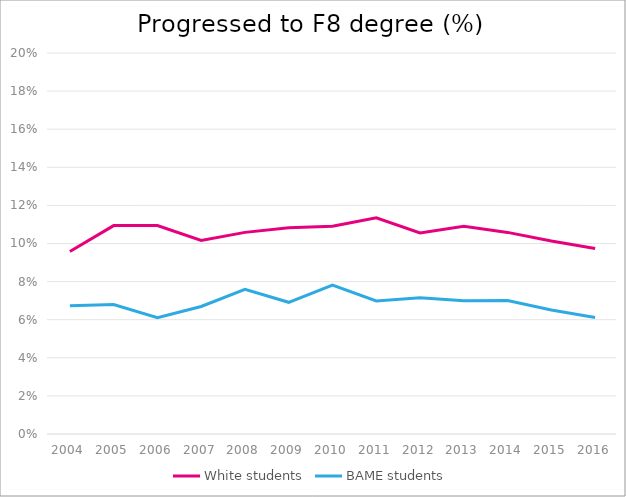
| Category | White students | BAME students |
|---|---|---|
| 2004.0 | 0.096 | 0.067 |
| 2005.0 | 0.109 | 0.068 |
| 2006.0 | 0.109 | 0.061 |
| 2007.0 | 0.102 | 0.067 |
| 2008.0 | 0.106 | 0.076 |
| 2009.0 | 0.108 | 0.069 |
| 2010.0 | 0.109 | 0.078 |
| 2011.0 | 0.113 | 0.07 |
| 2012.0 | 0.106 | 0.072 |
| 2013.0 | 0.109 | 0.07 |
| 2014.0 | 0.106 | 0.07 |
| 2015.0 | 0.101 | 0.065 |
| 2016.0 | 0.097 | 0.061 |